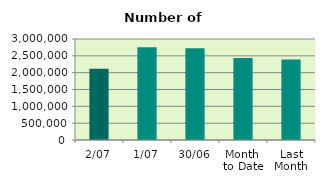
| Category | Series 0 |
|---|---|
| 2/07 | 2113154 |
| 1/07 | 2756068 |
| 30/06 | 2727516 |
| Month 
to Date | 2434611 |
| Last
Month | 2394428.455 |